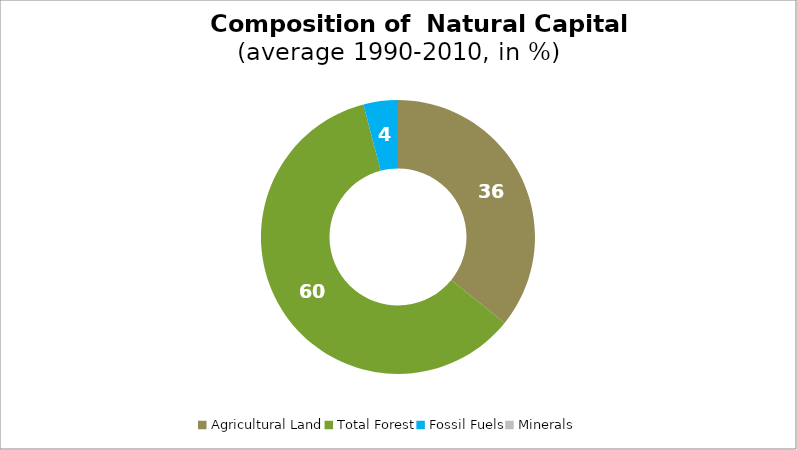
| Category | Series 0 |
|---|---|
| Agricultural Land | 35.812 |
| Total Forest | 60.126 |
| Fossil Fuels | 4.062 |
| Minerals | 0 |